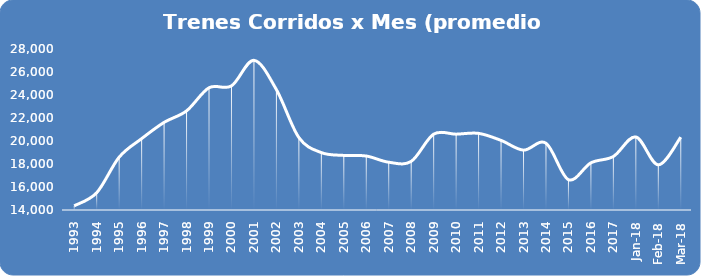
| Category | Series 0 |
|---|---|
| 1993.0 | 14364.583 |
| 1994.0 | 15502.75 |
| 1995.0 | 18594.75 |
| 1996.0 | 20205.25 |
| 1997.0 | 21620.333 |
| 1998.0 | 22620.583 |
| 1999.0 | 24631.167 |
| 2000.0 | 24794 |
| 2001.0 | 27013.333 |
| 2002.0 | 24467.5 |
| 2003.0 | 20300.917 |
| 2004.0 | 18991.333 |
| 2005.0 | 18745.833 |
| 2006.0 | 18694.167 |
| 2007.0 | 18154.417 |
| 2008.0 | 18228.917 |
| 2009.0 | 20595.75 |
| 2010.0 | 20594.667 |
| 2011.0 | 20663.75 |
| 2012.0 | 20052.667 |
| 2013.0 | 19206.5 |
| 2014.0 | 19808 |
| 2015.0 | 16637.5 |
| 2016.0 | 18102.583 |
| 2017.0 | 18655.333 |
| 43101.0 | 20351 |
| 43132.0 | 17927 |
| 43160.0 | 20331 |